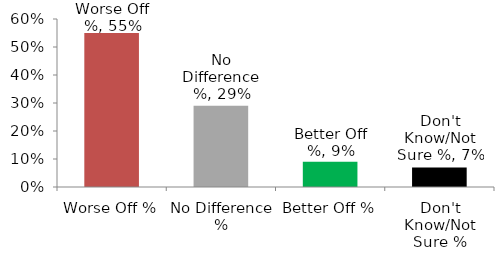
| Category | Worse Off % |
|---|---|
| Worse Off % | 0.55 |
| No Difference % | 0.29 |
| Better Off % | 0.09 |
| Don't Know/Not Sure % | 0.07 |